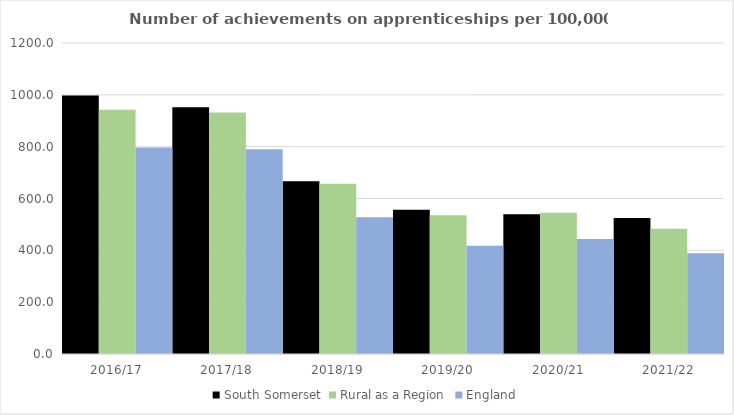
| Category | South Somerset | Rural as a Region | England |
|---|---|---|---|
| 2016/17 | 997 | 942.594 | 797 |
| 2017/18 | 952 | 931.709 | 790 |
| 2018/19 | 667 | 656.44 | 528 |
| 2019/20 | 557 | 535.552 | 418 |
| 2020/21 | 539 | 545.333 | 444 |
| 2021/22 | 525 | 482.936 | 389 |